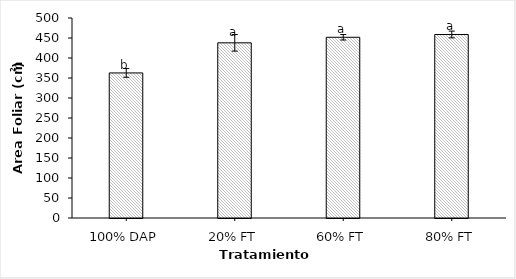
| Category | AF |
|---|---|
| 100% DAP | 362.69 |
| 20% FT | 437.938 |
| 60% FT | 451.8 |
| 80% FT | 458.787 |